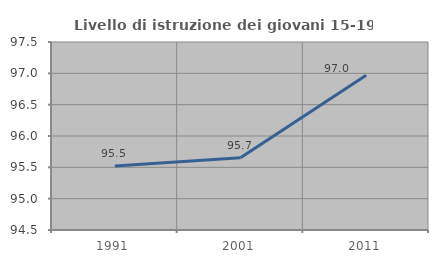
| Category | Livello di istruzione dei giovani 15-19 anni |
|---|---|
| 1991.0 | 95.522 |
| 2001.0 | 95.652 |
| 2011.0 | 96.97 |